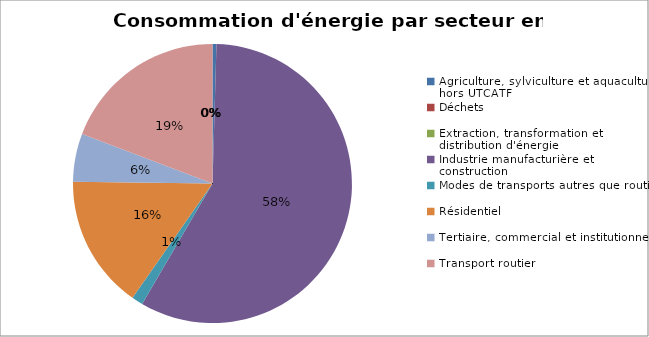
| Category | Series 0 |
|---|---|
| Agriculture, sylviculture et aquaculture hors UTCATF | 13578.969 |
| Déchets | 0 |
| Extraction, transformation et distribution d'énergie | 0 |
| Industrie manufacturière et construction | 1722798.745 |
| Modes de transports autres que routier | 38801.871 |
| Résidentiel | 459949.085 |
| Tertiaire, commercial et institutionnel | 165635.781 |
| Transport routier | 571616.733 |